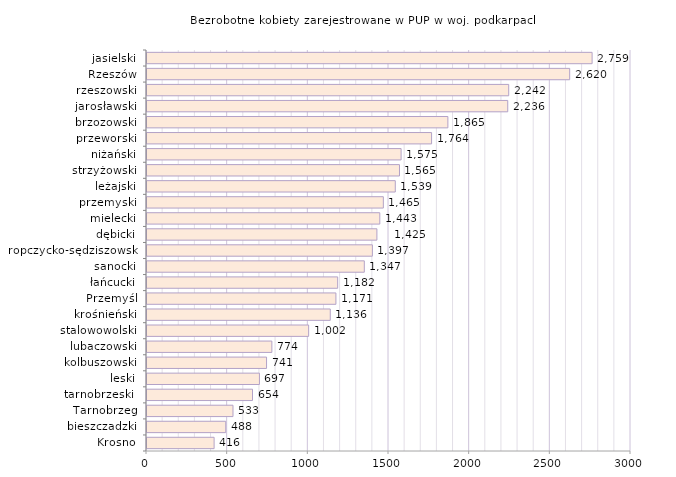
| Category | Bezrobotne kobiety zarejestrowane w PUP w woj. podkarpackim |
|---|---|
| Krosno | 416 |
| bieszczadzki | 488 |
| Tarnobrzeg | 533 |
| tarnobrzeski  | 654 |
| leski | 697 |
| kolbuszowski | 741 |
| lubaczowski | 774 |
| stalowowolski | 1002 |
| krośnieński | 1136 |
| Przemyśl | 1171 |
| łańcucki | 1182 |
| sanocki | 1347 |
| ropczycko-sędziszowski | 1397 |
| dębicki | 1425 |
| mielecki | 1443 |
| przemyski | 1465 |
| leżajski | 1539 |
| strzyżowski | 1565 |
| niżański | 1575 |
| przeworski | 1764 |
| brzozowski | 1865 |
| jarosławski | 2236 |
| rzeszowski | 2242 |
| Rzeszów | 2620 |
| jasielski | 2759 |